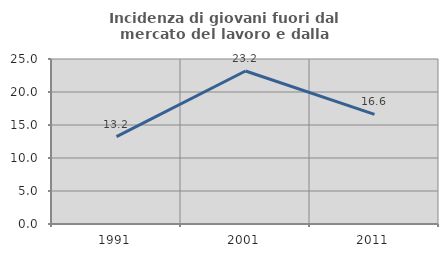
| Category | Incidenza di giovani fuori dal mercato del lavoro e dalla formazione  |
|---|---|
| 1991.0 | 13.228 |
| 2001.0 | 23.18 |
| 2011.0 | 16.619 |